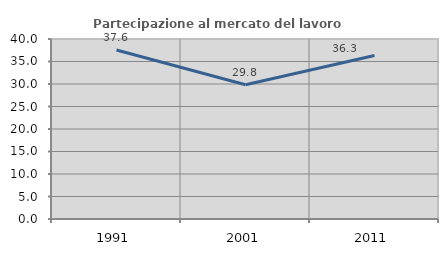
| Category | Partecipazione al mercato del lavoro  femminile |
|---|---|
| 1991.0 | 37.553 |
| 2001.0 | 29.838 |
| 2011.0 | 36.333 |